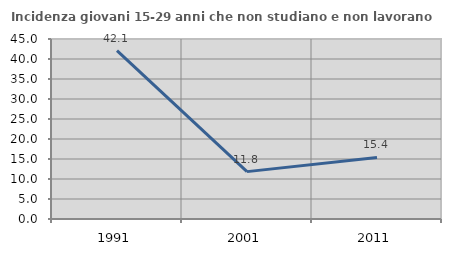
| Category | Incidenza giovani 15-29 anni che non studiano e non lavorano  |
|---|---|
| 1991.0 | 42.079 |
| 2001.0 | 11.842 |
| 2011.0 | 15.385 |